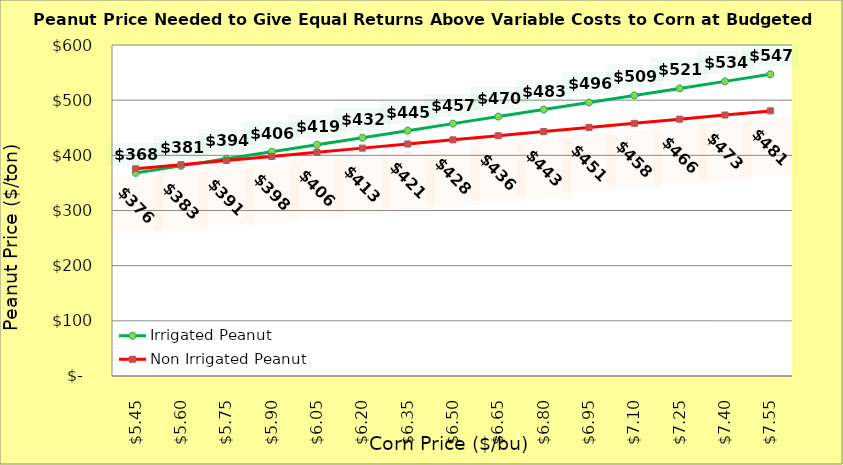
| Category | Irrigated Peanut | Non Irrigated Peanut |
|---|---|---|
| 5.4499999999999975 | 368.116 | 375.568 |
| 5.599999999999998 | 380.882 | 383.068 |
| 5.749999999999998 | 393.648 | 390.568 |
| 5.899999999999999 | 406.414 | 398.068 |
| 6.049999999999999 | 419.18 | 405.568 |
| 6.199999999999999 | 431.946 | 413.068 |
| 6.35 | 444.712 | 420.568 |
| 6.5 | 457.478 | 428.068 |
| 6.65 | 470.244 | 435.568 |
| 6.800000000000001 | 483.01 | 443.068 |
| 6.950000000000001 | 495.776 | 450.568 |
| 7.100000000000001 | 508.542 | 458.068 |
| 7.250000000000002 | 521.308 | 465.568 |
| 7.400000000000002 | 534.074 | 473.068 |
| 7.5500000000000025 | 546.84 | 480.568 |